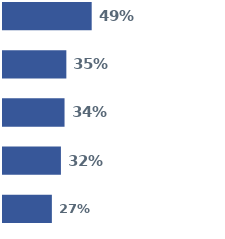
| Category | Series 0 | Series 1 | Series 2 | Series 3 | Series 4 |
|---|---|---|---|---|---|
| 0 | 0.49 | 0.35 | 0.34 | 0.32 | 0.27 |